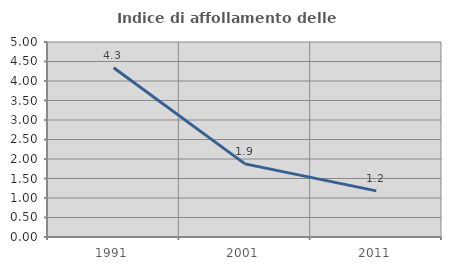
| Category | Indice di affollamento delle abitazioni  |
|---|---|
| 1991.0 | 4.339 |
| 2001.0 | 1.876 |
| 2011.0 | 1.183 |